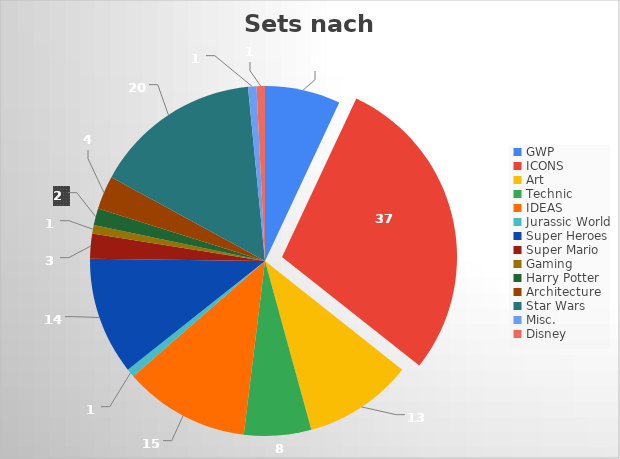
| Category | Sets |
|---|---|
| GWP | 9 |
| ICONS | 37 |
| Art | 13 |
| Technic | 8 |
| IDEAS | 15 |
| Jurassic World | 1 |
| Super Heroes | 14 |
| Super Mario | 3 |
| Gaming | 1 |
| Harry Potter | 2 |
| Architecture | 4 |
| Star Wars | 20 |
| Misc. | 1 |
| Disney | 1 |